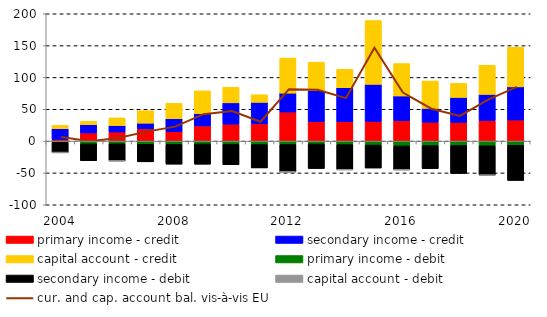
| Category | primary income - credit | secondary income - credit    | capital account - credit | primary income - debit | secondary income - debit | capital account - debit |
|---|---|---|---|---|---|---|
| 2004 | 2813.745 | 16653.959 | 5175.794 | -1910.086 | -16067.334 | -0.899 |
| 2005 | 12739.267 | 13065.558 | 5180.611 | -4373.728 | -26475.798 | 0 |
| 2006 | 14250.981 | 10238.261 | 12005.84 | -4233.003 | -26850.174 | -45.925 |
| 2007 | 19238.716 | 8945.791 | 19625.492 | -4967.636 | -27582.853 | 0 |
| 2008 | 14659.321 | 20481.121 | 24191.522 | -5178.004 | -31037.324 | 0 |
| 2009 | 23850.844 | 19318.111 | 35761.806 | -4441.197 | -31854.518 | 0 |
| 2010 | 26688.42 | 33436.11 | 24500.05 | -4791.473 | -32333.823 | 0 |
| 2011 | 27111.993 | 33761.239 | 11968.474 | -5416.196 | -36696.875 | 0 |
| 2012 | 45687.224 | 29688.811 | 55039.996 | -5384.315 | -43043.329 | -3.64 |
| 2013 | 30666.913 | 48802.736 | 44549.908 | -4431.919 | -38640.61 | 0 |
| 2014 | 30349.755 | 53415.104 | 29086.827 | -5448.216 | -39581.544 | -3.157 |
| 2015 | 30962.259 | 58177.176 | 100192.201 | -6169.563 | -36117.151 | 0 |
| 2016 | 32123.825 | 38778.291 | 50916.176 | -7502.088 | -37600.511 | -14.824 |
| 2017 | 29723.199 | 21619.752 | 43058.108 | -7055.943 | -36123.377 | 0 |
| 2018 | 29463.855 | 39175.935 | 22034.92 | -6847.708 | -43991.423 | 0 |
| 2019 | 32445.509 | 40925.444 | 45758.091 | -7367.808 | -46046.516 | -39.34 |
| 2020 | 33088.081 | 52119.834 | 62098.1 | -6592.607 | -55234.825 | 0 |